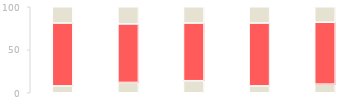
| Category | Series 0 | Series 1 | Series 2 | Series 3 | Series 4 |
|---|---|---|---|---|---|
| 2011.0 | 8 | 30 | 23 | 20 | 19 |
| 2012.0 | 12 | 24 | 25 | 19 | 20 |
| 2013.0 | 14 | 20 | 26 | 21 | 19 |
| 2014.0 | 8 | 21 | 30 | 22 | 19 |
| 2015.0 | 10 | 21 | 29 | 22 | 18 |